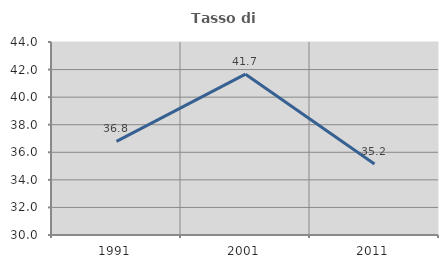
| Category | Tasso di occupazione   |
|---|---|
| 1991.0 | 36.788 |
| 2001.0 | 41.667 |
| 2011.0 | 35.156 |